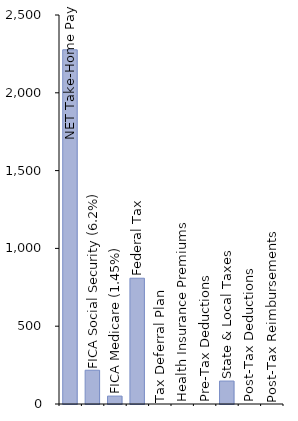
| Category | Series 0 |
|---|---|
| NET Take-Home Pay | 2276.4 |
| FICA Social Security (6.2%) | 217 |
| FICA Medicare (1.45%) | 50.75 |
| Federal Tax | 808.333 |
| Tax Deferral Plan | 0 |
| Health Insurance Premiums | 0 |
| Pre-Tax Deductions | 0 |
| State & Local Taxes | 147.517 |
| Post-Tax Deductions | 0 |
| Post-Tax Reimbursements | 0 |